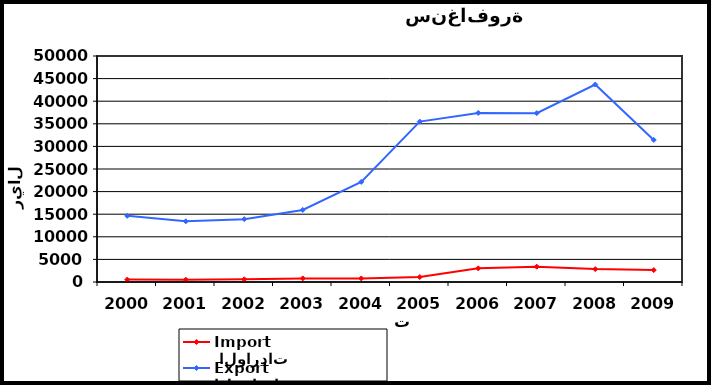
| Category |  الواردات           Import | الصادرات          Export |
|---|---|---|
| 2000.0 | 542 | 14632 |
| 2001.0 | 505 | 13429 |
| 2002.0 | 599 | 13905 |
| 2003.0 | 800 | 15940 |
| 2004.0 | 791 | 22147 |
| 2005.0 | 1094 | 35488 |
| 2006.0 | 3020 | 37405 |
| 2007.0 | 3381 | 37360 |
| 2008.0 | 2854 | 43693 |
| 2009.0 | 2635 | 31429 |